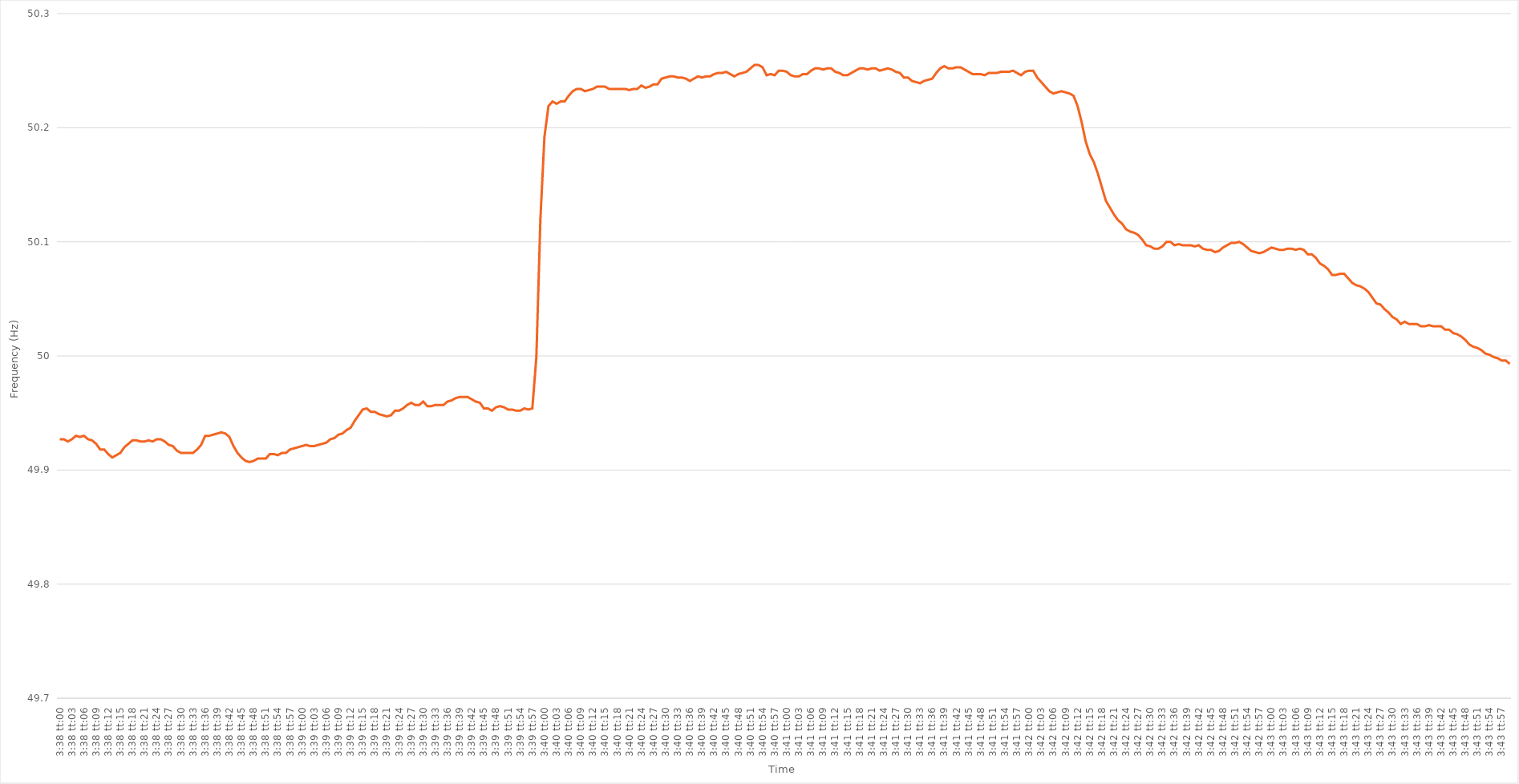
| Category | Series 0 |
|---|---|
| 0.15138888888888888 | 49.927 |
| 0.15140046296296297 | 49.927 |
| 0.15141203703703704 | 49.925 |
| 0.1514236111111111 | 49.927 |
| 0.1514351851851852 | 49.93 |
| 0.15144675925925927 | 49.929 |
| 0.15145833333333333 | 49.93 |
| 0.1514699074074074 | 49.927 |
| 0.15148148148148147 | 49.926 |
| 0.15149305555555556 | 49.923 |
| 0.15150462962962963 | 49.918 |
| 0.1515162037037037 | 49.918 |
| 0.1515277777777778 | 49.914 |
| 0.15153935185185186 | 49.911 |
| 0.15155092592592592 | 49.913 |
| 0.15156250000000002 | 49.915 |
| 0.15157407407407408 | 49.92 |
| 0.15158564814814815 | 49.923 |
| 0.15159722222222222 | 49.926 |
| 0.15160879629629628 | 49.926 |
| 0.15162037037037038 | 49.925 |
| 0.15163194444444444 | 49.925 |
| 0.1516435185185185 | 49.926 |
| 0.1516550925925926 | 49.925 |
| 0.15166666666666667 | 49.927 |
| 0.15167824074074074 | 49.927 |
| 0.1516898148148148 | 49.925 |
| 0.15170138888888887 | 49.922 |
| 0.15171296296296297 | 49.921 |
| 0.15172453703703703 | 49.917 |
| 0.1517361111111111 | 49.915 |
| 0.1517476851851852 | 49.915 |
| 0.15175925925925926 | 49.915 |
| 0.15177083333333333 | 49.915 |
| 0.15178240740740742 | 49.918 |
| 0.1517939814814815 | 49.922 |
| 0.15180555555555555 | 49.93 |
| 0.15181712962962965 | 49.93 |
| 0.1518287037037037 | 49.931 |
| 0.15184027777777778 | 49.932 |
| 0.15185185185185185 | 49.933 |
| 0.15186342592592592 | 49.932 |
| 0.151875 | 49.929 |
| 0.15188657407407408 | 49.921 |
| 0.15189814814814814 | 49.915 |
| 0.15190972222222224 | 49.911 |
| 0.15192129629629628 | 49.908 |
| 0.15193287037037037 | 49.907 |
| 0.15194444444444444 | 49.908 |
| 0.1519560185185185 | 49.91 |
| 0.1519675925925926 | 49.91 |
| 0.15197916666666667 | 49.91 |
| 0.15199074074074073 | 49.914 |
| 0.15200231481481483 | 49.914 |
| 0.1520138888888889 | 49.913 |
| 0.15202546296296296 | 49.915 |
| 0.15203703703703705 | 49.915 |
| 0.15204861111111112 | 49.918 |
| 0.1520601851851852 | 49.919 |
| 0.15207175925925925 | 49.92 |
| 0.15208333333333332 | 49.921 |
| 0.15209490740740741 | 49.922 |
| 0.15210648148148148 | 49.921 |
| 0.15211805555555555 | 49.921 |
| 0.15212962962962964 | 49.922 |
| 0.1521412037037037 | 49.923 |
| 0.15215277777777778 | 49.924 |
| 0.15216435185185184 | 49.927 |
| 0.1521759259259259 | 49.928 |
| 0.1521875 | 49.931 |
| 0.15219907407407407 | 49.932 |
| 0.15221064814814814 | 49.935 |
| 0.15222222222222223 | 49.937 |
| 0.1522337962962963 | 49.943 |
| 0.15224537037037036 | 49.948 |
| 0.15225694444444446 | 49.953 |
| 0.15226851851851853 | 49.954 |
| 0.1522800925925926 | 49.951 |
| 0.15229166666666666 | 49.951 |
| 0.15230324074074075 | 49.949 |
| 0.15231481481481482 | 49.948 |
| 0.1523263888888889 | 49.947 |
| 0.15233796296296295 | 49.948 |
| 0.15234953703703705 | 49.952 |
| 0.1523611111111111 | 49.952 |
| 0.15237268518518518 | 49.954 |
| 0.15238425925925925 | 49.957 |
| 0.15239583333333334 | 49.959 |
| 0.1524074074074074 | 49.957 |
| 0.15241898148148147 | 49.957 |
| 0.15243055555555554 | 49.96 |
| 0.15244212962962964 | 49.956 |
| 0.1524537037037037 | 49.956 |
| 0.15246527777777777 | 49.957 |
| 0.15247685185185186 | 49.957 |
| 0.15248842592592593 | 49.957 |
| 0.1525 | 49.96 |
| 0.1525115740740741 | 49.961 |
| 0.15252314814814816 | 49.963 |
| 0.15253472222222222 | 49.964 |
| 0.1525462962962963 | 49.964 |
| 0.15255787037037036 | 49.964 |
| 0.15256944444444445 | 49.962 |
| 0.15258101851851852 | 49.96 |
| 0.15259259259259259 | 49.959 |
| 0.15260416666666668 | 49.954 |
| 0.15261574074074075 | 49.954 |
| 0.1526273148148148 | 49.952 |
| 0.15263888888888888 | 49.955 |
| 0.15265046296296295 | 49.956 |
| 0.15266203703703704 | 49.955 |
| 0.1526736111111111 | 49.953 |
| 0.15268518518518517 | 49.953 |
| 0.15269675925925927 | 49.952 |
| 0.15270833333333333 | 49.952 |
| 0.1527199074074074 | 49.954 |
| 0.1527314814814815 | 49.953 |
| 0.15274305555555556 | 49.954 |
| 0.15275462962962963 | 49.999 |
| 0.15276620370370372 | 50.12 |
| 0.15277777777777776 | 50.192 |
| 0.15278935185185186 | 50.219 |
| 0.15280092592592592 | 50.223 |
| 0.1528125 | 50.221 |
| 0.15282407407407408 | 50.223 |
| 0.15283564814814815 | 50.223 |
| 0.15284722222222222 | 50.228 |
| 0.1528587962962963 | 50.232 |
| 0.15287037037037035 | 50.234 |
| 0.15288194444444445 | 50.234 |
| 0.1528935185185185 | 50.232 |
| 0.15290509259259258 | 50.233 |
| 0.15291666666666667 | 50.234 |
| 0.15292824074074074 | 50.236 |
| 0.1529398148148148 | 50.236 |
| 0.1529513888888889 | 50.236 |
| 0.15296296296296297 | 50.234 |
| 0.15297453703703703 | 50.234 |
| 0.15298611111111113 | 50.234 |
| 0.1529976851851852 | 50.234 |
| 0.15300925925925926 | 50.234 |
| 0.15302083333333333 | 50.233 |
| 0.1530324074074074 | 50.234 |
| 0.1530439814814815 | 50.234 |
| 0.15305555555555556 | 50.237 |
| 0.15306712962962962 | 50.235 |
| 0.15307870370370372 | 50.236 |
| 0.15309027777777778 | 50.238 |
| 0.15310185185185185 | 50.238 |
| 0.15311342592592592 | 50.243 |
| 0.15312499999999998 | 50.244 |
| 0.15313657407407408 | 50.245 |
| 0.15314814814814814 | 50.245 |
| 0.1531597222222222 | 50.244 |
| 0.1531712962962963 | 50.244 |
| 0.15318287037037037 | 50.243 |
| 0.15319444444444444 | 50.241 |
| 0.15320601851851853 | 50.243 |
| 0.1532175925925926 | 50.245 |
| 0.15322916666666667 | 50.244 |
| 0.15324074074074073 | 50.245 |
| 0.1532523148148148 | 50.245 |
| 0.1532638888888889 | 50.247 |
| 0.15327546296296296 | 50.248 |
| 0.15328703703703703 | 50.248 |
| 0.15329861111111112 | 50.249 |
| 0.1533101851851852 | 50.247 |
| 0.15332175925925925 | 50.245 |
| 0.15333333333333332 | 50.247 |
| 0.15334490740740742 | 50.248 |
| 0.15335648148148148 | 50.249 |
| 0.15336805555555555 | 50.252 |
| 0.15337962962962962 | 50.255 |
| 0.1533912037037037 | 50.255 |
| 0.15340277777777778 | 50.253 |
| 0.15341435185185184 | 50.246 |
| 0.15342592592592594 | 50.247 |
| 0.1534375 | 50.246 |
| 0.15344907407407407 | 50.25 |
| 0.15346064814814817 | 50.25 |
| 0.15347222222222223 | 50.249 |
| 0.1534837962962963 | 50.246 |
| 0.15349537037037037 | 50.245 |
| 0.15350694444444443 | 50.245 |
| 0.15351851851851853 | 50.247 |
| 0.1535300925925926 | 50.247 |
| 0.15354166666666666 | 50.25 |
| 0.15355324074074075 | 50.252 |
| 0.15356481481481482 | 50.252 |
| 0.1535763888888889 | 50.251 |
| 0.15358796296296295 | 50.252 |
| 0.15359953703703702 | 50.252 |
| 0.15361111111111111 | 50.249 |
| 0.15362268518518518 | 50.248 |
| 0.15363425925925925 | 50.246 |
| 0.15364583333333334 | 50.246 |
| 0.1536574074074074 | 50.248 |
| 0.15366898148148148 | 50.25 |
| 0.15368055555555557 | 50.252 |
| 0.15369212962962964 | 50.252 |
| 0.1537037037037037 | 50.251 |
| 0.1537152777777778 | 50.252 |
| 0.15372685185185184 | 50.252 |
| 0.15373842592592593 | 50.25 |
| 0.15375 | 50.251 |
| 0.15376157407407406 | 50.252 |
| 0.15377314814814816 | 50.251 |
| 0.15378472222222223 | 50.249 |
| 0.1537962962962963 | 50.248 |
| 0.1538078703703704 | 50.244 |
| 0.15381944444444443 | 50.244 |
| 0.15383101851851852 | 50.241 |
| 0.1538425925925926 | 50.24 |
| 0.15385416666666665 | 50.239 |
| 0.15386574074074075 | 50.241 |
| 0.15387731481481481 | 50.242 |
| 0.15388888888888888 | 50.243 |
| 0.15390046296296298 | 50.248 |
| 0.15391203703703704 | 50.252 |
| 0.1539236111111111 | 50.254 |
| 0.1539351851851852 | 50.252 |
| 0.15394675925925924 | 50.252 |
| 0.15395833333333334 | 50.253 |
| 0.1539699074074074 | 50.253 |
| 0.15398148148148147 | 50.251 |
| 0.15399305555555556 | 50.249 |
| 0.15400462962962963 | 50.247 |
| 0.1540162037037037 | 50.247 |
| 0.1540277777777778 | 50.247 |
| 0.15403935185185186 | 50.246 |
| 0.15405092592592592 | 50.248 |
| 0.1540625 | 50.248 |
| 0.15407407407407406 | 50.248 |
| 0.15408564814814815 | 50.249 |
| 0.15409722222222222 | 50.249 |
| 0.15410879629629629 | 50.249 |
| 0.15412037037037038 | 50.25 |
| 0.15413194444444445 | 50.248 |
| 0.1541435185185185 | 50.246 |
| 0.1541550925925926 | 50.249 |
| 0.15416666666666667 | 50.25 |
| 0.15417824074074074 | 50.25 |
| 0.1541898148148148 | 50.244 |
| 0.15420138888888887 | 50.24 |
| 0.15421296296296297 | 50.236 |
| 0.15422453703703703 | 50.232 |
| 0.1542361111111111 | 50.23 |
| 0.1542476851851852 | 50.231 |
| 0.15425925925925926 | 50.232 |
| 0.15427083333333333 | 50.231 |
| 0.1542824074074074 | 50.23 |
| 0.15429398148148146 | 50.228 |
| 0.15430555555555556 | 50.219 |
| 0.15431712962962962 | 50.205 |
| 0.1543287037037037 | 50.188 |
| 0.15434027777777778 | 50.177 |
| 0.15435185185185185 | 50.17 |
| 0.15436342592592592 | 50.16 |
| 0.154375 | 50.148 |
| 0.15438657407407408 | 50.136 |
| 0.15439814814814815 | 50.13 |
| 0.15440972222222224 | 50.124 |
| 0.1544212962962963 | 50.119 |
| 0.15443287037037037 | 50.116 |
| 0.15444444444444444 | 50.111 |
| 0.1544560185185185 | 50.109 |
| 0.1544675925925926 | 50.108 |
| 0.15447916666666667 | 50.106 |
| 0.15449074074074073 | 50.102 |
| 0.15450231481481483 | 50.097 |
| 0.1545138888888889 | 50.096 |
| 0.15452546296296296 | 50.094 |
| 0.15453703703703703 | 50.094 |
| 0.1545486111111111 | 50.096 |
| 0.1545601851851852 | 50.1 |
| 0.15457175925925926 | 50.1 |
| 0.15458333333333332 | 50.097 |
| 0.15459490740740742 | 50.098 |
| 0.15460648148148148 | 50.097 |
| 0.15461805555555555 | 50.097 |
| 0.15462962962962964 | 50.097 |
| 0.1546412037037037 | 50.096 |
| 0.15465277777777778 | 50.097 |
| 0.15466435185185187 | 50.094 |
| 0.1546759259259259 | 50.093 |
| 0.1546875 | 50.093 |
| 0.15469907407407407 | 50.091 |
| 0.15471064814814814 | 50.092 |
| 0.15472222222222223 | 50.095 |
| 0.1547337962962963 | 50.097 |
| 0.15474537037037037 | 50.099 |
| 0.15475694444444446 | 50.099 |
| 0.1547685185185185 | 50.1 |
| 0.1547800925925926 | 50.098 |
| 0.15479166666666666 | 50.095 |
| 0.15480324074074073 | 50.092 |
| 0.15481481481481482 | 50.091 |
| 0.1548263888888889 | 50.09 |
| 0.15483796296296296 | 50.091 |
| 0.15484953703703705 | 50.093 |
| 0.15486111111111112 | 50.095 |
| 0.15487268518518518 | 50.094 |
| 0.15488425925925928 | 50.093 |
| 0.15489583333333332 | 50.093 |
| 0.1549074074074074 | 50.094 |
| 0.15491898148148148 | 50.094 |
| 0.15493055555555554 | 50.093 |
| 0.15494212962962964 | 50.094 |
| 0.1549537037037037 | 50.093 |
| 0.15496527777777777 | 50.089 |
| 0.15497685185185187 | 50.089 |
| 0.1549884259259259 | 50.086 |
| 0.155 | 50.081 |
| 0.15501157407407407 | 50.079 |
| 0.15502314814814813 | 50.076 |
| 0.15503472222222223 | 50.071 |
| 0.1550462962962963 | 50.071 |
| 0.15505787037037036 | 50.072 |
| 0.15506944444444445 | 50.072 |
| 0.15508101851851852 | 50.068 |
| 0.1550925925925926 | 50.064 |
| 0.15510416666666668 | 50.062 |
| 0.15511574074074075 | 50.061 |
| 0.15512731481481482 | 50.059 |
| 0.15513888888888888 | 50.056 |
| 0.15515046296296295 | 50.051 |
| 0.15516203703703704 | 50.046 |
| 0.1551736111111111 | 50.045 |
| 0.15518518518518518 | 50.041 |
| 0.15519675925925927 | 50.038 |
| 0.15520833333333334 | 50.034 |
| 0.1552199074074074 | 50.032 |
| 0.15523148148148147 | 50.028 |
| 0.15524305555555554 | 50.03 |
| 0.15525462962962963 | 50.028 |
| 0.1552662037037037 | 50.028 |
| 0.15527777777777776 | 50.028 |
| 0.15528935185185186 | 50.026 |
| 0.15530092592592593 | 50.026 |
| 0.1553125 | 50.027 |
| 0.1553240740740741 | 50.026 |
| 0.15533564814814815 | 50.026 |
| 0.15534722222222222 | 50.026 |
| 0.15535879629629631 | 50.023 |
| 0.15537037037037038 | 50.023 |
| 0.15538194444444445 | 50.02 |
| 0.15539351851851851 | 50.019 |
| 0.15540509259259258 | 50.017 |
| 0.15541666666666668 | 50.014 |
| 0.15542824074074074 | 50.01 |
| 0.1554398148148148 | 50.008 |
| 0.1554513888888889 | 50.007 |
| 0.15546296296296297 | 50.005 |
| 0.15547453703703704 | 50.002 |
| 0.1554861111111111 | 50.001 |
| 0.15549768518518517 | 49.999 |
| 0.15550925925925926 | 49.998 |
| 0.15552083333333333 | 49.996 |
| 0.1555324074074074 | 49.996 |
| 0.1555439814814815 | 49.993 |